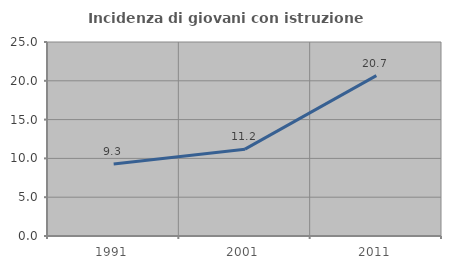
| Category | Incidenza di giovani con istruzione universitaria |
|---|---|
| 1991.0 | 9.274 |
| 2001.0 | 11.191 |
| 2011.0 | 20.673 |